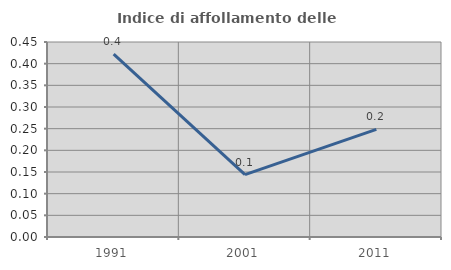
| Category | Indice di affollamento delle abitazioni  |
|---|---|
| 1991.0 | 0.422 |
| 2001.0 | 0.144 |
| 2011.0 | 0.248 |